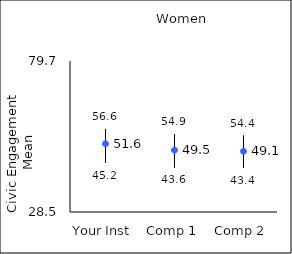
| Category | 25th percentile | 75th percentile | Mean |
|---|---|---|---|
| Your Inst | 45.2 | 56.6 | 51.64 |
| Comp 1 | 43.6 | 54.9 | 49.47 |
| Comp 2 | 43.4 | 54.4 | 49.08 |